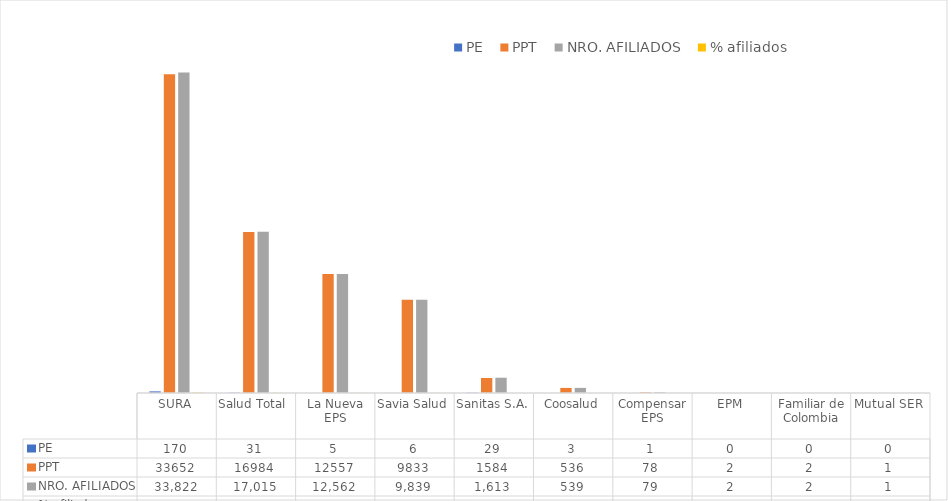
| Category | PE | PPT | NRO. AFILIADOS | % afiliados |
|---|---|---|---|---|
| SURA | 170 | 33652 | 33822 | 44.813 |
| Salud Total  | 31 | 16984 | 17015 | 22.544 |
| La Nueva EPS | 5 | 12557 | 12562 | 16.644 |
| Savia Salud | 6 | 9833 | 9839 | 13.036 |
| Sanitas S.A. | 29 | 1584 | 1613 | 2.137 |
| Coosalud | 3 | 536 | 539 | 0.714 |
| Compensar EPS | 1 | 78 | 79 | 0.105 |
| EPM | 0 | 2 | 2 | 0.003 |
| Familiar de Colombia | 0 | 2 | 2 | 0.003 |
| Mutual SER | 0 | 1 | 1 | 0.001 |